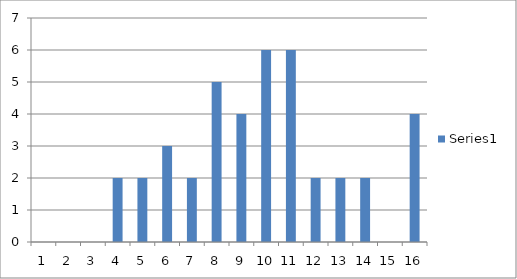
| Category | Series 0 |
|---|---|
| 0 | 0 |
| 1 | 0 |
| 2 | 0 |
| 3 | 2 |
| 4 | 2 |
| 5 | 3 |
| 6 | 2 |
| 7 | 5 |
| 8 | 4 |
| 9 | 6 |
| 10 | 6 |
| 11 | 2 |
| 12 | 2 |
| 13 | 2 |
| 14 | 0 |
| 15 | 4 |